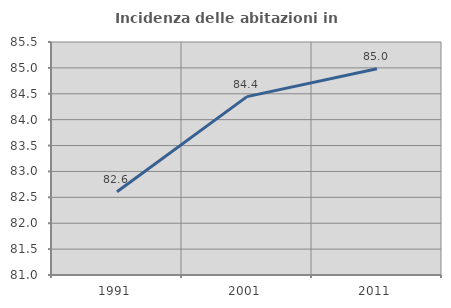
| Category | Incidenza delle abitazioni in proprietà  |
|---|---|
| 1991.0 | 82.609 |
| 2001.0 | 84.444 |
| 2011.0 | 84.982 |